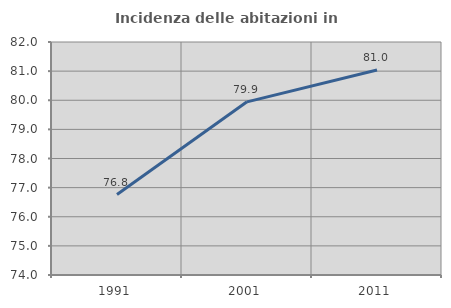
| Category | Incidenza delle abitazioni in proprietà  |
|---|---|
| 1991.0 | 76.763 |
| 2001.0 | 79.946 |
| 2011.0 | 81.041 |